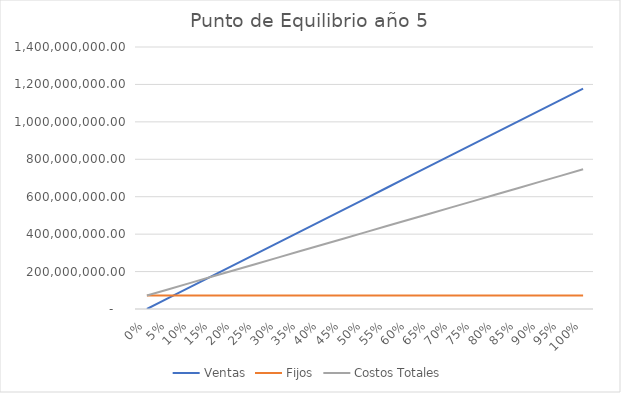
| Category | Ventas | Fijos | Costos Totales |
|---|---|---|---|
| 0.0 | 0 | 72187570.929 | 72187570.929 |
| 0.05 | 58899456 | 72187570.929 | 105906778.519 |
| 0.1 | 117798912 | 72187570.929 | 139625986.109 |
| 0.15 | 176698368 | 72187570.929 | 173345193.699 |
| 0.2 | 235597824 | 72187570.929 | 207064401.289 |
| 0.25 | 294497280 | 72187570.929 | 240783608.878 |
| 0.3 | 353396736 | 72187570.929 | 274502816.468 |
| 0.35 | 412296192 | 72187570.929 | 308222024.058 |
| 0.4 | 471195648 | 72187570.929 | 341941231.648 |
| 0.45 | 530095104 | 72187570.929 | 375660439.238 |
| 0.5 | 588994560 | 72187570.929 | 409379646.828 |
| 0.55 | 647894016 | 72187570.929 | 443098854.418 |
| 0.6 | 706793472 | 72187570.929 | 476818062.008 |
| 0.65 | 765692928 | 72187570.929 | 510537269.598 |
| 0.7 | 824592384 | 72187570.929 | 544256477.188 |
| 0.75 | 883491840 | 72187570.929 | 577975684.778 |
| 0.8 | 942391296 | 72187570.929 | 611694892.368 |
| 0.85 | 1001290752 | 72187570.929 | 645414099.957 |
| 0.9 | 1060190208 | 72187570.929 | 679133307.547 |
| 0.95 | 1119089664 | 72187570.929 | 712852515.137 |
| 1.0 | 1177989120 | 72187570.929 | 746571722.727 |